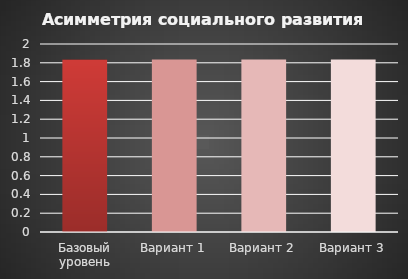
| Category | Асимметрия социального развития региона |
|---|---|
| Базовый уровень | 1.835 |
| Вариант 1 | 1.835 |
| Вариант 2 | 1.835 |
| Вариант 3 | 1.835 |